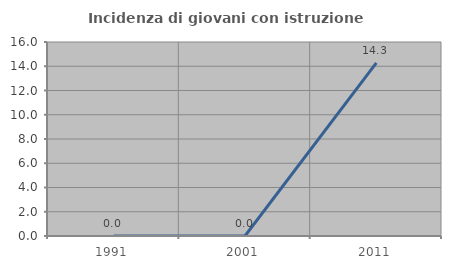
| Category | Incidenza di giovani con istruzione universitaria |
|---|---|
| 1991.0 | 0 |
| 2001.0 | 0 |
| 2011.0 | 14.286 |